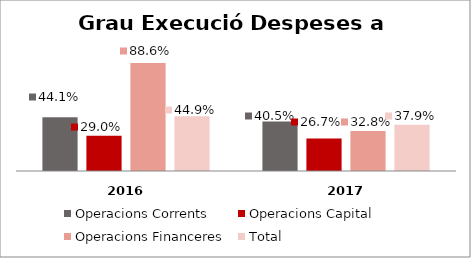
| Category | Operacions Corrents | Operacions Capital | Operacions Financeres | Total |
|---|---|---|---|---|
| 0 | 0.441 | 0.29 | 0.886 | 0.449 |
| 1 | 0.405 | 0.267 | 0.328 | 0.379 |